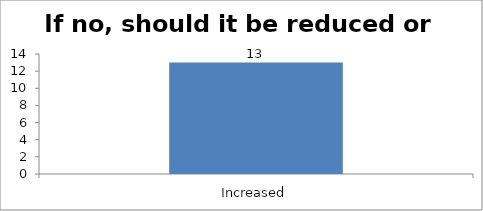
| Category | If no, should it be reduced or increased |
|---|---|
| Increased | 13 |